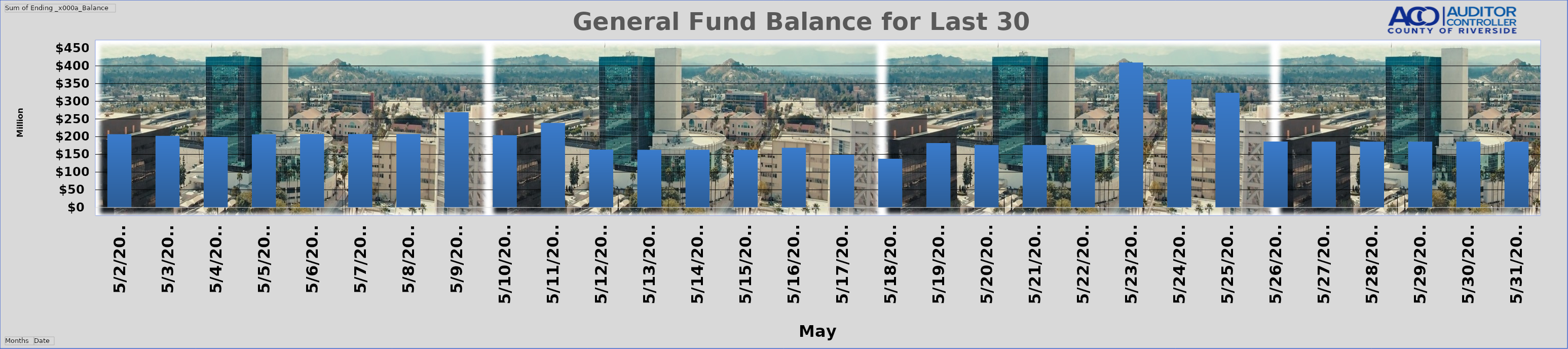
| Category | Total |
|---|---|
| 0 | 207213711.555 |
| 1/1/00 | 202382376.385 |
| 1/2/00 | 199589017.705 |
| 1/3/00 | 206715665.485 |
| 1/4/00 | 207384540.095 |
| 1/5/00 | 207384540.095 |
| 1/6/00 | 207384540.095 |
| 1/7/00 | 269106156.255 |
| 1/8/00 | 204319626.705 |
| 1/9/00 | 239022644.545 |
| 1/10/00 | 163636558.595 |
| 1/11/00 | 163041262.495 |
| 1/12/00 | 163041262.495 |
| 1/13/00 | 163041262.495 |
| 1/14/00 | 168628655.505 |
| 1/15/00 | 148977259.635 |
| 1/16/00 | 137740549.475 |
| 1/17/00 | 181876660.725 |
| 1/18/00 | 176661281.265 |
| 1/19/00 | 176661281.265 |
| 1/20/00 | 176661281.265 |
| 1/21/00 | 409412873.115 |
| 1/22/00 | 362019049.965 |
| 1/23/00 | 324281021.605 |
| 1/24/00 | 186394946.455 |
| 1/25/00 | 185877183.085 |
| 1/26/00 | 185877183.085 |
| 1/27/00 | 185877183.085 |
| 1/28/00 | 185877183.085 |
| 1/29/00 | 185669132.405 |